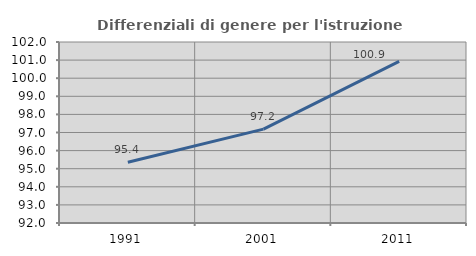
| Category | Differenziali di genere per l'istruzione superiore |
|---|---|
| 1991.0 | 95.357 |
| 2001.0 | 97.187 |
| 2011.0 | 100.927 |